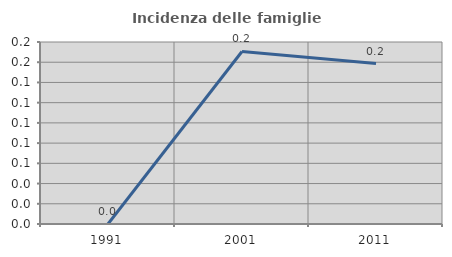
| Category | Incidenza delle famiglie numerose |
|---|---|
| 1991.0 | 0 |
| 2001.0 | 0.171 |
| 2011.0 | 0.159 |